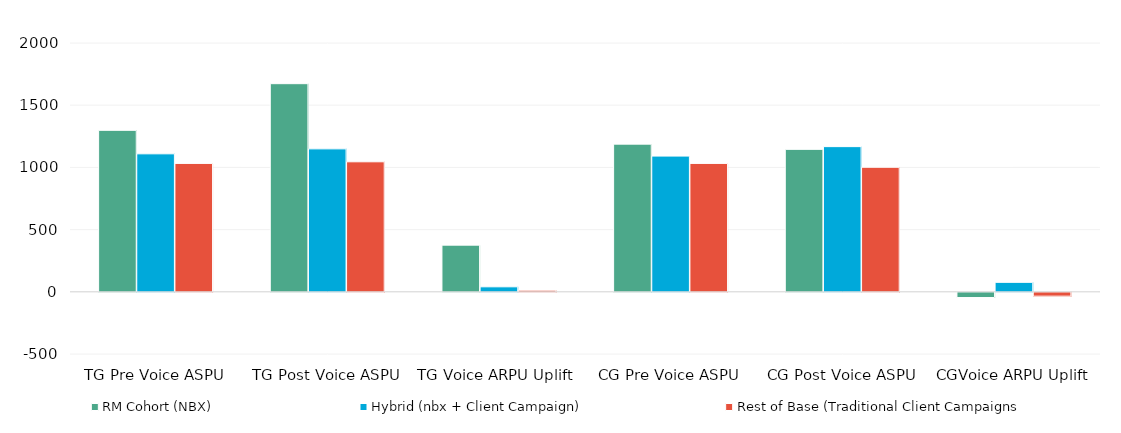
| Category | RM Cohort (NBX)  | Hybrid (nbx + Client Campaign) | Rest of Base (Traditional Client Campaigns |
|---|---|---|---|
| TG Pre Voice ASPU | 1298 | 1109 | 1032 |
| TG Post Voice ASPU | 1673 | 1149 | 1045 |
| TG Voice ARPU Uplift  | 375 | 40 | 13 |
| CG Pre Voice ASPU | 1187 | 1091 | 1032 |
| CG Post Voice ASPU | 1145 | 1167 | 1001 |
| CGVoice ARPU Uplift | -42 | 76 | -31 |